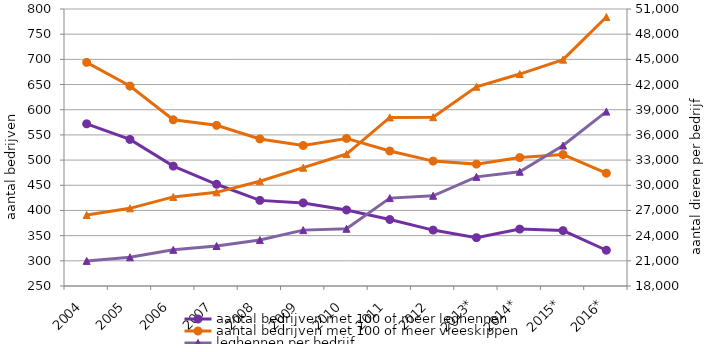
| Category | aantal bedrijven met 100 of meer leghennen | aantal bedrijven met 100 of meer vleeskippen |
|---|---|---|
| 2004 | 572 | 694 |
| 2005 | 541 | 647 |
| 2006 | 488 | 580 |
| 2007 | 452 | 569 |
| 2008 | 420 | 542 |
| 2009 | 415 | 529 |
| 2010 | 401 | 543 |
| 2011 | 382 | 518 |
| 2012 | 361 | 498 |
| 2013* | 346 | 492 |
| 2014* | 363 | 505 |
| 2015* | 360 | 511 |
| 2016* | 321 | 474 |